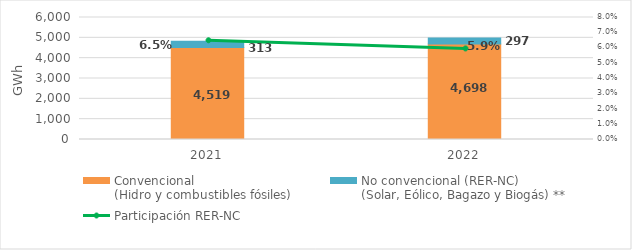
| Category | Convencional
(Hidro y combustibles fósiles) | No convencional (RER-NC)
(Solar, Eólico, Bagazo y Biogás) ** |
|---|---|---|
| 2021.0 | 4518.989 | 312.849 |
| 2022.0 | 4698.105 | 296.573 |